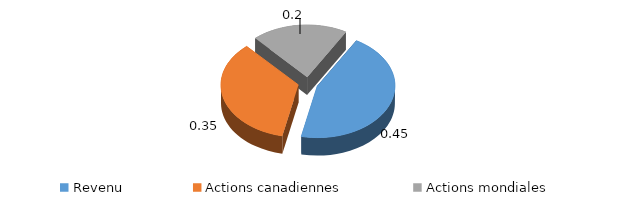
| Category | Series 0 |
|---|---|
| Revenu | 0.45 |
| Actions canadiennes | 0.35 |
| Actions mondiales | 0.2 |